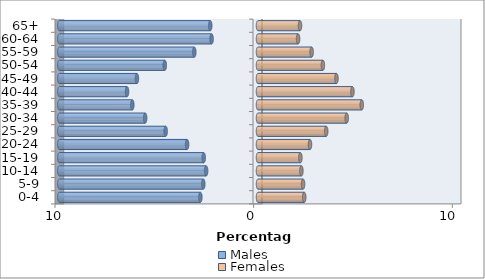
| Category | Males | Females |
|---|---|---|
| 0-4 | -2.9 | 2.327 |
| 5-9 | -2.754 | 2.269 |
| 10-14 | -2.611 | 2.184 |
| 15-19 | -2.732 | 2.134 |
| 20-24 | -3.569 | 2.616 |
| 25-29 | -4.649 | 3.434 |
| 30-34 | -5.68 | 4.466 |
| 35-39 | -6.326 | 5.224 |
| 40-44 | -6.593 | 4.753 |
| 45-49 | -6.095 | 3.95 |
| 50-54 | -4.692 | 3.266 |
| 55-59 | -3.207 | 2.7 |
| 60-64 | -2.335 | 2.018 |
| 65+ | -2.404 | 2.114 |